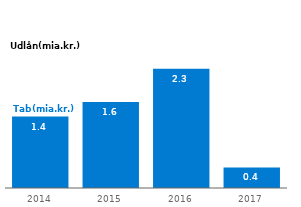
| Category | Tab |
|---|---|
| 2014.0 | 1.363 |
| 2015.0 | 1.64 |
| 2016.0 | 2.277 |
| 2017.0 | 0.392 |